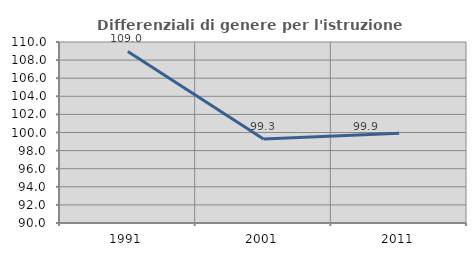
| Category | Differenziali di genere per l'istruzione superiore |
|---|---|
| 1991.0 | 108.953 |
| 2001.0 | 99.293 |
| 2011.0 | 99.914 |